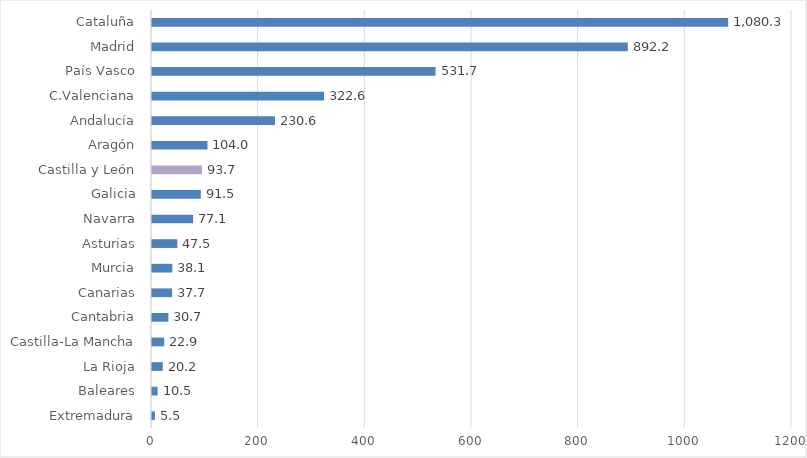
| Category | Series 0 |
|---|---|
| Extremadura | 5.5 |
| Baleares | 10.5 |
| La Rioja | 20.2 |
| Castilla-La Mancha | 22.9 |
| Cantabria | 30.7 |
| Canarias | 37.7 |
| Murcia | 38.1 |
| Asturias | 47.5 |
| Navarra | 77.1 |
| Galicia | 91.5 |
| Castilla y León | 93.7 |
| Aragón | 104 |
| Andalucía | 230.6 |
| C.Valenciana | 322.6 |
| País Vasco | 531.7 |
| Madrid | 892.2 |
| Cataluña | 1080.3 |